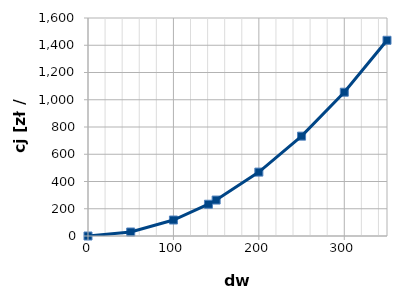
| Category | cj |
|---|---|
| 0.0 | 0 |
| 50.0 | 29.315 |
| 100.0 | 117.258 |
| 141.0 | 233.121 |
| 150.0 | 263.831 |
| 200.0 | 469.033 |
| 250.0 | 732.864 |
| 300.0 | 1055.325 |
| 350.0 | 1436.414 |